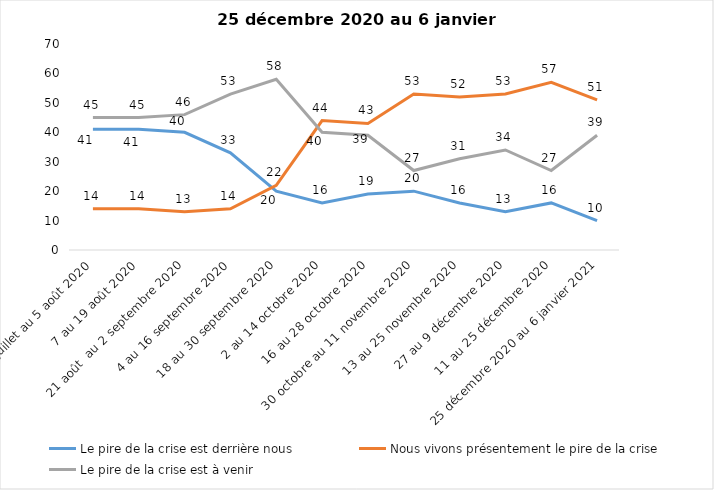
| Category | Le pire de la crise est derrière nous | Nous vivons présentement le pire de la crise | Le pire de la crise est à venir |
|---|---|---|---|
| 24 juillet au 5 août 2020 | 41 | 14 | 45 |
| 7 au 19 août 2020 | 41 | 14 | 45 |
| 21 août  au 2 septembre 2020 | 40 | 13 | 46 |
| 4 au 16 septembre 2020 | 33 | 14 | 53 |
| 18 au 30 septembre 2020 | 20 | 22 | 58 |
| 2 au 14 octobre 2020 | 16 | 44 | 40 |
| 16 au 28 octobre 2020 | 19 | 43 | 39 |
| 30 octobre au 11 novembre 2020 | 20 | 53 | 27 |
| 13 au 25 novembre 2020 | 16 | 52 | 31 |
| 27 au 9 décembre 2020 | 13 | 53 | 34 |
| 11 au 25 décembre 2020 | 16 | 57 | 27 |
| 25 décembre 2020 au 6 janvier 2021 | 10 | 51 | 39 |